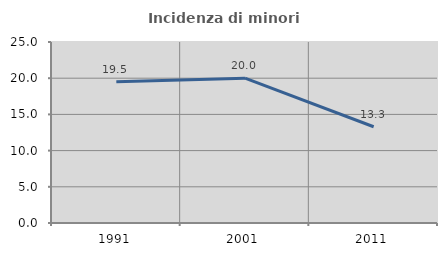
| Category | Incidenza di minori stranieri |
|---|---|
| 1991.0 | 19.512 |
| 2001.0 | 20 |
| 2011.0 | 13.297 |